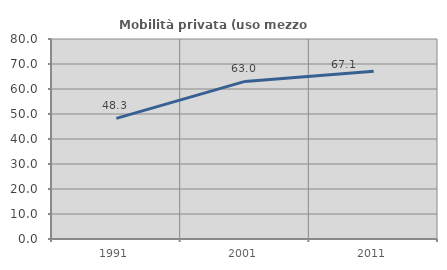
| Category | Mobilità privata (uso mezzo privato) |
|---|---|
| 1991.0 | 48.264 |
| 2001.0 | 63.033 |
| 2011.0 | 67.052 |